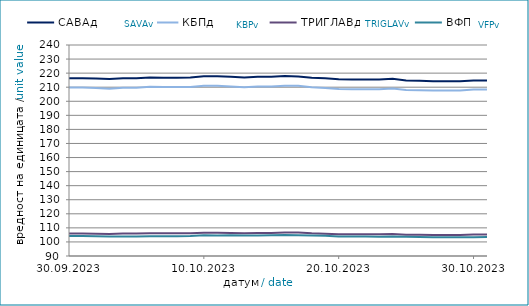
| Category | САВАд | КБПд | ТРИГЛАВд | ВФПд |
|---|---|---|---|---|
| 2023-09-30 | 216.322 | 209.716 | 105.999 | 104.164 |
| 2023-10-01 | 216.33 | 209.724 | 106.005 | 104.169 |
| 2023-10-02 | 216.166 | 209.435 | 105.852 | 104.104 |
| 2023-10-03 | 215.765 | 208.981 | 105.646 | 103.797 |
| 2023-10-04 | 216.429 | 209.685 | 105.96 | 103.864 |
| 2023-10-05 | 216.358 | 209.676 | 105.934 | 103.853 |
| 2023-10-06 | 216.891 | 210.261 | 106.196 | 104.117 |
| 2023-10-07 | 216.717 | 210.064 | 106.101 | 104.086 |
| 2023-10-08 | 216.725 | 210.073 | 106.106 | 104.092 |
| 2023-10-09 | 216.912 | 210.23 | 106.238 | 104.238 |
| 2023-10-10 | 217.736 | 210.977 | 106.576 | 104.749 |
| 2023-10-11 | 217.736 | 210.983 | 106.559 | 104.608 |
| 2023-10-12 | 217.427 | 210.51 | 106.36 | 104.8 |
| 2023-10-13 | 216.944 | 209.908 | 106.094 | 104.557 |
| 2023-10-14 | 217.429 | 210.446 | 106.36 | 104.659 |
| 2023-10-15 | 217.438 | 210.454 | 106.366 | 104.665 |
| 2023-10-16 | 217.978 | 211.077 | 106.66 | 104.862 |
| 2023-10-17 | 217.63 | 210.98 | 106.635 | 104.792 |
| 2023-10-18 | 216.674 | 209.891 | 106.121 | 104.537 |
| 2023-10-19 | 216.296 | 209.447 | 105.856 | 104.359 |
| 2023-10-20 | 215.629 | 208.76 | 105.537 | 103.811 |
| 2023-10-21 | 215.477 | 208.587 | 105.452 | 103.783 |
| 2023-10-22 | 215.485 | 208.595 | 105.457 | 103.788 |
| 2023-10-23 | 215.426 | 208.553 | 105.414 | 103.748 |
| 2023-10-24 | 215.92 | 208.987 | 105.605 | 103.823 |
| 2023-10-25 | 214.752 | 208.031 | 105.154 | 103.647 |
| 2023-10-26 | 214.498 | 207.769 | 105.037 | 103.422 |
| 2023-10-27 | 214.218 | 207.718 | 104.978 | 103.275 |
| 2023-10-28 | 214.218 | 207.724 | 104.981 | 103.281 |
| 2023-10-29 | 214.227 | 207.733 | 104.987 | 103.288 |
| 2023-10-30 | 214.78 | 208.408 | 105.33 | 103.331 |
| 2023-10-31 | 214.814 | 208.364 | 105.335 | 103.479 |